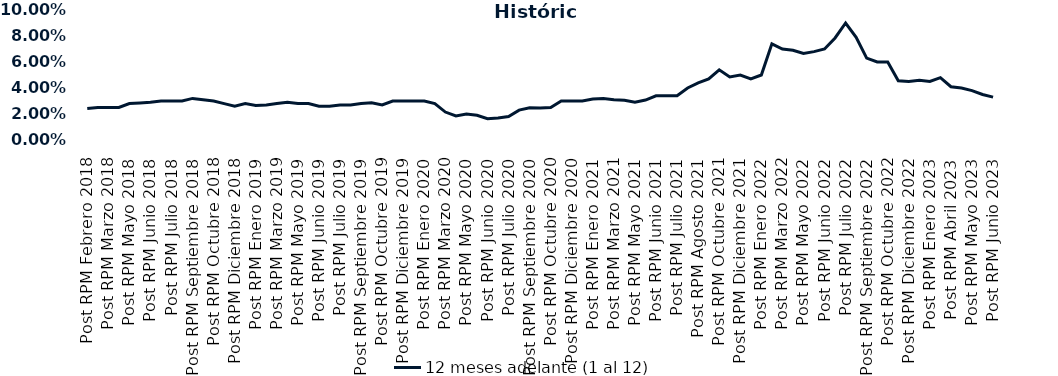
| Category | 12 meses adelante (1 al 12)  |
|---|---|
| Post RPM Febrero 2018 | 0.024 |
| Pre RPM Marzo 2018 | 0.025 |
| Post RPM Marzo 2018 | 0.025 |
| Pre RPM Mayo 2018 | 0.025 |
| Post RPM Mayo 2018 | 0.028 |
| Pre RPM Junio 2018 | 0.028 |
| Post RPM Junio 2018 | 0.029 |
| Pre RPM Julio 2018 | 0.03 |
| Post RPM Julio 2018 | 0.03 |
| Pre RPM Septiembre 2018 | 0.03 |
| Post RPM Septiembre 2018 | 0.032 |
| Pre RPM Octubre 2018 | 0.031 |
| Post RPM Octubre 2018 | 0.03 |
| Pre RPM Diciembre 2018 | 0.028 |
| Post RPM Diciembre 2018 | 0.026 |
| Pre RPM Enero 2019 | 0.028 |
| Post RPM Enero 2019 | 0.026 |
| Pre RPM Marzo 2019 | 0.027 |
| Post RPM Marzo 2019 | 0.028 |
| Pre RPM Mayo 2019 | 0.029 |
| Post RPM Mayo 2019 | 0.028 |
| Pre RPM Junio 2019 | 0.028 |
| Post RPM Junio 2019 | 0.026 |
| Pre RPM Julio 2019 | 0.026 |
| Post RPM Julio 2019 | 0.027 |
| Pre RPM Septiembre 2019 | 0.027 |
| Post RPM Septiembre 2019 | 0.028 |
| Pre RPM Octubre 2019 | 0.029 |
| Post RPM Octubre 2019 | 0.027 |
| Pre RPM Diciembre 2019 | 0.03 |
| Post RPM Diciembre 2019 | 0.03 |
| Pre RPM Enero 2020 | 0.03 |
| Post RPM Enero 2020 | 0.03 |
| Pre RPM Marzo 2020 | 0.028 |
| Post RPM Marzo 2020 | 0.022 |
| Pre RPM Mayo 2020 | 0.018 |
| Post RPM Mayo 2020 | 0.02 |
| Pre RPM Junio 2020 | 0.019 |
| Post RPM Junio 2020 | 0.016 |
| Pre RPM Julio 2020 | 0.017 |
| Post RPM Julio 2020 | 0.018 |
| Pre RPM Septiembre 2020 | 0.023 |
| Post RPM Septiembre 2020 | 0.025 |
| Pre RPM Octubre 2020 | 0.025 |
| Post RPM Octubre 2020 | 0.025 |
| Pre RPM Diciembre 2020 | 0.03 |
| Post RPM Diciembre 2020 | 0.03 |
| Pre RPM Enero 2021 | 0.03 |
| Post RPM Enero 2021 | 0.032 |
| Pre RPM Marzo 2021 | 0.032 |
| Post RPM Marzo 2021 | 0.031 |
| Pre RPM Mayo 2021 | 0.03 |
| Post RPM Mayo 2021 | 0.029 |
| Pre RPM Junio 2021 | 0.031 |
| Post RPM Junio 2021 | 0.034 |
| Pre RPM Julio 2021 | 0.034 |
| Post RPM Julio 2021 | 0.034 |
| Pre RPM Agosto 2021 | 0.04 |
| Post RPM Agosto 2021 | 0.044 |
| Pre RPM Octubre 2021 | 0.047 |
| Post RPM Octubre 2021 | 0.054 |
| Pre RPM Diciembre 2021 | 0.048 |
| Post RPM Diciembre 2021 | 0.05 |
| Pre RPM Enero 2022 | 0.047 |
| Post RPM Enero 2022 | 0.05 |
| Pre RPM Marzo 2022 | 0.074 |
| Post RPM Marzo 2022 | 0.07 |
| Pre RPM Mayo 2022 | 0.069 |
| Post RPM Mayo 2022 | 0.066 |
| Pre RPM Junio 2022 | 0.068 |
| Post RPM Junio 2022 | 0.07 |
| Pre RPM Julio 2022 | 0.078 |
| Post RPM Julio 2022 | 0.09 |
| Pre RPM Septiembre 2022 | 0.079 |
| Post RPM Septiembre 2022 | 0.063 |
| Pre RPM Octubre 2022 | 0.06 |
| Post RPM Octubre 2022 | 0.06 |
| Pre RPM Diciembre 2022 | 0.046 |
| Post RPM Diciembre 2022 | 0.045 |
| Pre RPM Enero 2023 | 0.046 |
| Post RPM Enero 2023 | 0.045 |
| Pre RPM Abril 2023 | 0.048 |
| Post RPM Abril 2023 | 0.041 |
| Pre RPM Mayo 2023 | 0.04 |
| Post RPM Mayo 2023 | 0.038 |
| Pre RPM Junio 2023 | 0.035 |
| Post RPM Junio 2023 | 0.033 |